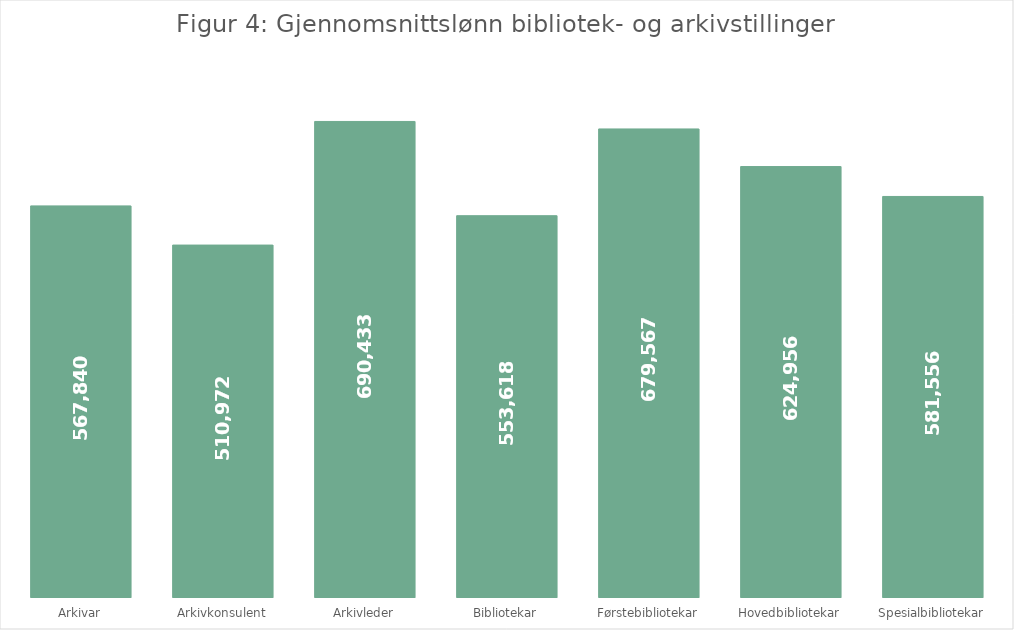
| Category | Series 4 |
|---|---|
| Arkivar | 567840.214 |
| Arkivkonsulent | 510972 |
| Arkivleder | 690433.333 |
| Bibliotekar | 553617.75 |
| Førstebibliotekar | 679566.667 |
| Hovedbibliotekar | 624956 |
| Spesialbibliotekar | 581555.55 |